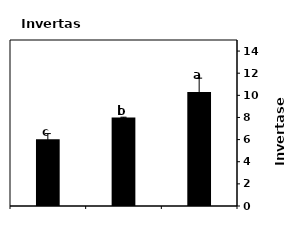
| Category | Invertase activity(mg/d/g) |
|---|---|
| CK | 6.035 |
| FR | 7.986 |
| FRM | 10.295 |